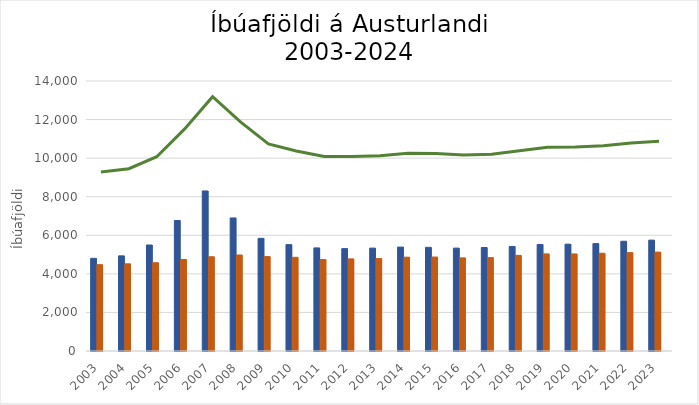
| Category | Karlar | Konur | Kynsegin / annað |
|---|---|---|---|
| 2003.0 | 4804 | 4476 | 0 |
| 2004.0 | 4933 | 4520 | 0 |
| 2005.0 | 5497 | 4576 | 0 |
| 2006.0 | 6768 | 4748 | 0 |
| 2007.0 | 8298 | 4887 | 0 |
| 2008.0 | 6900 | 4977 | 0 |
| 2009.0 | 5841 | 4896 | 0 |
| 2010.0 | 5515 | 4858 | 0 |
| 2011.0 | 5345 | 4741 | 0 |
| 2012.0 | 5309 | 4776 | 0 |
| 2013.0 | 5335 | 4794 | 0 |
| 2014.0 | 5389 | 4864 | 0 |
| 2015.0 | 5375 | 4872 | 0 |
| 2016.0 | 5334 | 4829 | 0 |
| 2017.0 | 5367 | 4841 | 0 |
| 2018.0 | 5421 | 4959 | 0 |
| 2019.0 | 5525 | 5035 | 0 |
| 2020.0 | 5539 | 5033 | 0 |
| 2021.0 | 5568 | 5069 | 0 |
| 2022.0 | 5691 | 5100 | 0 |
| 2023.0 | 5749 | 5128 | 4 |